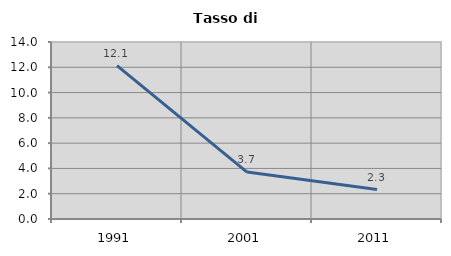
| Category | Tasso di disoccupazione   |
|---|---|
| 1991.0 | 12.134 |
| 2001.0 | 3.711 |
| 2011.0 | 2.33 |